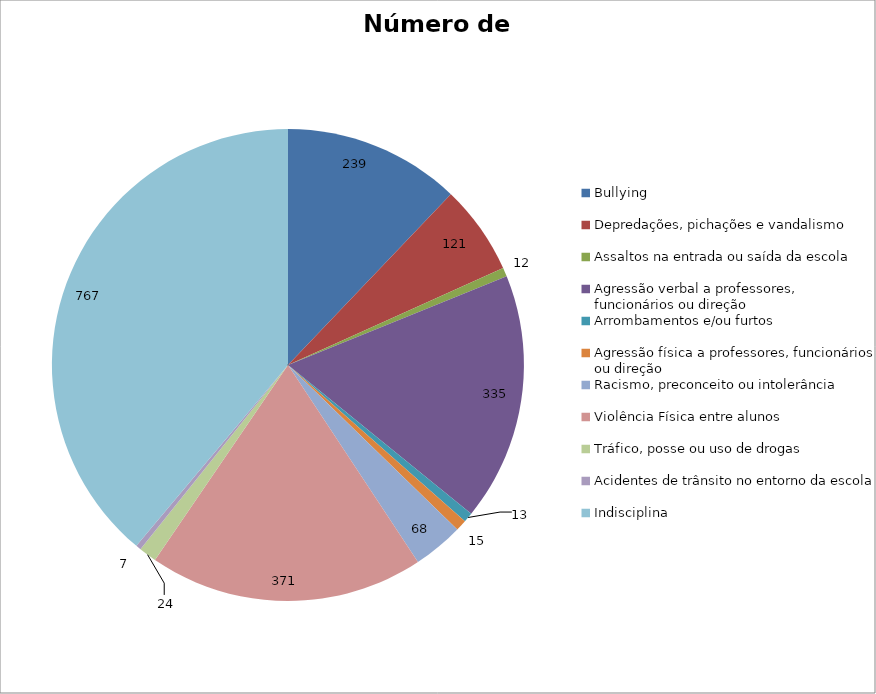
| Category | Número de Casos |
|---|---|
| Bullying | 239 |
| Depredações, pichações e vandalismo | 121 |
| Assaltos na entrada ou saída da escola | 12 |
| Agressão verbal a professores, funcionários ou direção | 335 |
| Arrombamentos e/ou furtos | 13 |
| Agressão física a professores, funcionários ou direção | 15 |
| Racismo, preconceito ou intolerância | 68 |
| Violência Física entre alunos | 371 |
| Tráfico, posse ou uso de drogas | 24 |
| Acidentes de trânsito no entorno da escola | 7 |
| Indisciplina | 767 |